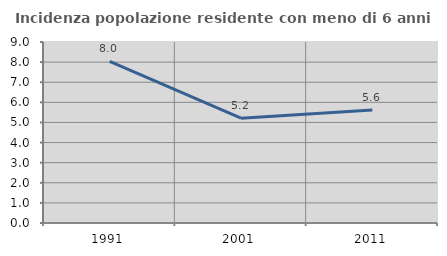
| Category | Incidenza popolazione residente con meno di 6 anni |
|---|---|
| 1991.0 | 8.036 |
| 2001.0 | 5.211 |
| 2011.0 | 5.614 |